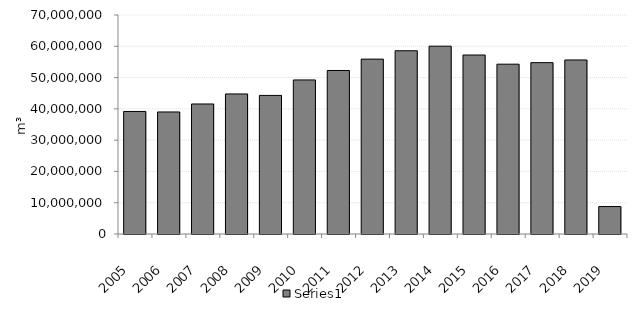
| Category | Series 0 |
|---|---|
| 2005.0 | 39167154.702 |
| 2006.0 | 39008397.496 |
| 2007.0 | 41558179.59 |
| 2008.0 | 44763952.307 |
| 2009.0 | 44298462.788 |
| 2010.0 | 49239039.243 |
| 2011.0 | 52263911.583 |
| 2012.0 | 55900363.671 |
| 2013.0 | 58572495.084 |
| 2014.0 | 60031617.589 |
| 2015.0 | 57210870.372 |
| 2016.0 | 54278570.073 |
| 2017.0 | 54772292.485 |
| 2018.0 | 55629467.172 |
| 2019.0 | 8771415.538 |